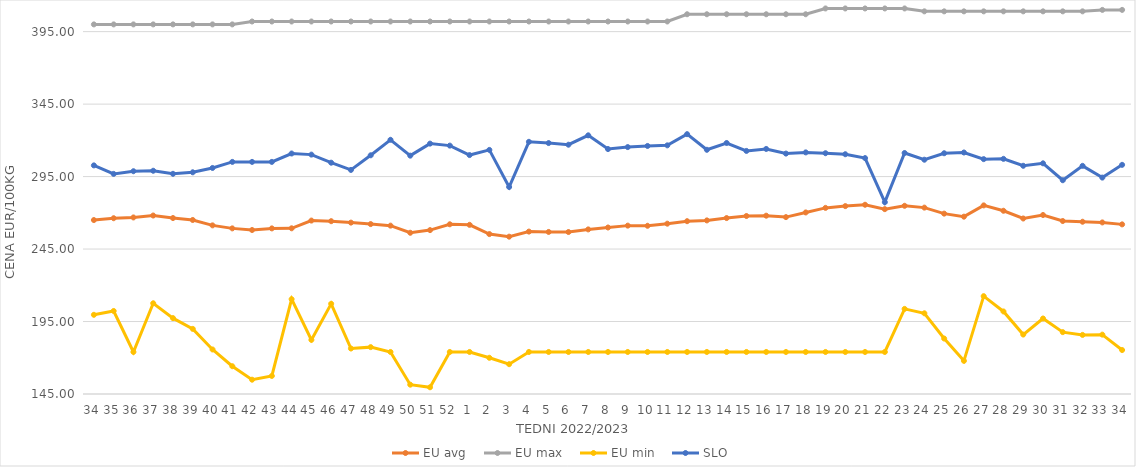
| Category | EU avg | EU max | EU min | SLO |
|---|---|---|---|---|
| 34.0 | 265.016 | 400 | 199.637 | 302.73 |
| 35.0 | 266.273 | 400 | 202.277 | 296.86 |
| 36.0 | 266.807 | 400 | 174 | 298.7 |
| 37.0 | 268.136 | 400 | 207.594 | 299.02 |
| 38.0 | 266.39 | 400 | 197.352 | 296.91 |
| 39.0 | 265.059 | 400 | 189.926 | 297.96 |
| 40.0 | 261.35 | 400 | 175.723 | 300.95 |
| 41.0 | 259.271 | 400 | 164.165 | 305.13 |
| 42.0 | 258.146 | 402 | 154.869 | 305.13 |
| 43.0 | 259.256 | 402 | 157.459 | 305.13 |
| 44.0 | 259.32 | 402 | 210.415 | 310.93 |
| 45.0 | 264.649 | 402 | 182.35 | 310.16 |
| 46.0 | 264.228 | 402 | 207.247 | 304.58 |
| 47.0 | 263.24 | 402 | 176.378 | 299.59 |
| 48.0 | 262.225 | 402 | 177.332 | 309.69 |
| 49.0 | 261.152 | 402 | 174 | 320.38 |
| 50.0 | 256.24 | 402 | 151.434 | 309.44 |
| 51.0 | 258.071 | 402 | 149.638 | 317.74 |
| 52.0 | 262.088 | 402 | 174 | 316.36 |
| 1.0 | 261.716 | 402 | 174 | 309.84 |
| 2.0 | 255.331 | 402 | 169.983 | 313.4 |
| 3.0 | 253.546 | 402 | 165.574 | 287.81 |
| 4.0 | 257.051 | 402 | 174 | 318.98 |
| 5.0 | 256.808 | 402 | 174 | 318.13 |
| 6.0 | 256.75 | 402 | 174 | 316.99 |
| 7.0 | 258.565 | 402 | 174 | 323.47 |
| 8.0 | 259.872 | 402 | 174 | 314 |
| 9.0 | 261.164 | 402 | 174 | 315.35 |
| 10.0 | 261.06 | 402 | 174 | 316.13 |
| 11.0 | 262.513 | 402 | 174 | 316.55 |
| 12.0 | 264.228 | 407 | 174 | 324.27 |
| 13.0 | 264.768 | 407 | 174 | 313.49 |
| 14.0 | 266.385 | 407 | 174 | 318.17 |
| 15.0 | 267.797 | 407 | 174 | 312.7 |
| 16.0 | 268.021 | 407 | 174 | 314.07 |
| 17.0 | 267.041 | 407 | 174 | 310.87 |
| 18.0 | 270.255 | 407 | 174 | 311.69 |
| 19.0 | 273.406 | 411 | 174 | 311.13 |
| 20.0 | 274.631 | 411 | 174 | 310.42 |
| 21.0 | 275.561 | 411 | 174 | 307.76 |
| 22.0 | 272.542 | 411 | 174 | 277.34 |
| 23.0 | 274.85 | 411 | 203.728 | 311.28 |
| 24.0 | 273.59 | 409 | 200.686 | 306.64 |
| 25.0 | 269.439 | 409 | 183.275 | 311.1 |
| 26.0 | 267.345 | 409 | 167.858 | 311.62 |
| 27.0 | 275.123 | 409 | 212.506 | 307.04 |
| 28.0 | 271.42 | 409 | 201.945 | 307.23 |
| 29.0 | 266.08 | 409 | 186.018 | 302.45 |
| 30.0 | 268.489 | 409 | 197.093 | 304.14 |
| 31.0 | 264.333 | 409 | 187.684 | 292.49 |
| 32.0 | 263.843 | 409 | 185.774 | 302.41 |
| 33.0 | 263.37 | 410 | 185.951 | 294.3 |
| 34.0 | 262.029 | 410 | 175.332 | 303.1 |